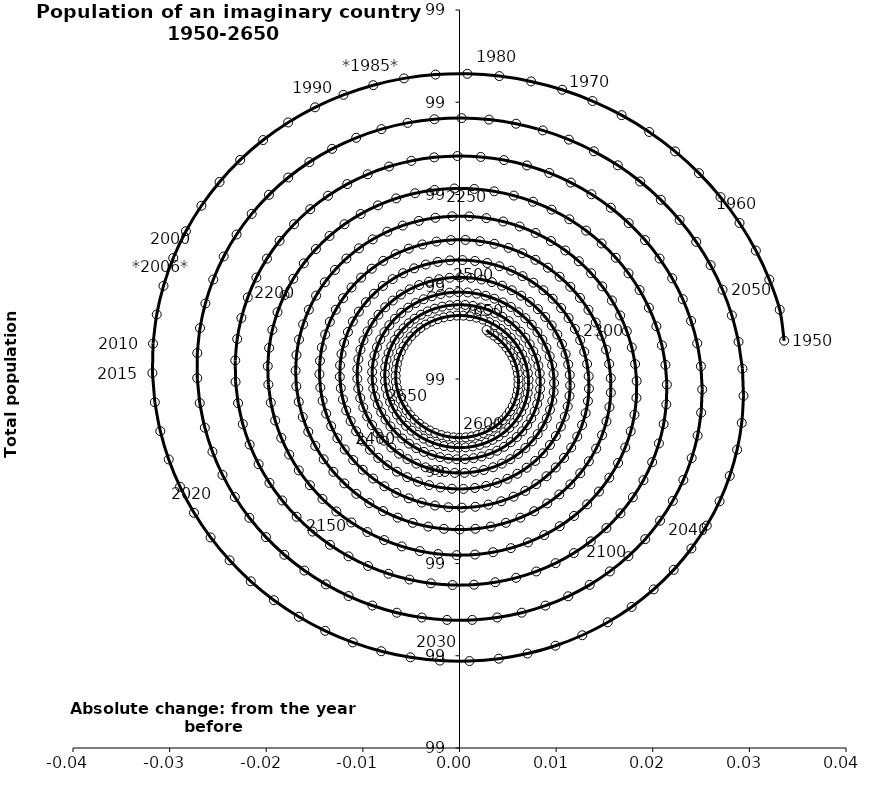
| Category | Series 0 |
|---|---|
| 0.033599910458875115 | 99.041 |
| 0.03314166945899899 | 99.075 |
| 0.032064497750972976 | 99.108 |
| 0.030672920638316725 | 99.139 |
| 0.028982384361654567 | 99.169 |
| 0.027011239629715078 | 99.197 |
| 0.024780544122428694 | 99.223 |
| 0.02231383898252659 | 99.247 |
| 0.019636901654472183 | 99.268 |
| 0.01677747765348414 | 99.286 |
| 0.013764994045004642 | 99.301 |
| 0.010630257583116531 | 99.314 |
| 0.007405140594826776 | 99.323 |
| 0.004122257804290541 | 99.328 |
| 0.0008146373648330041 | 99.331 |
| -0.002484610591359626 | 99.33 |
| -0.0057426245679437216 | 99.326 |
| -0.008927118190648287 | 99.319 |
| -0.01200669932943299 | 99.308 |
| -0.014951178710695956 | 99.294 |
| -0.01773186499434587 | 99.278 |
| -0.020321843440299858 | 99.259 |
| -0.02269623546710875 | 99.237 |
| -0.024832436609635522 | 99.214 |
| -0.026710330610171695 | 99.188 |
| -0.028312477626954546 | 99.16 |
| -0.02962427481232055 | 99.131 |
| -0.030634087796677534 | 99.101 |
| -0.0313333519121457 | 99.07 |
| -0.031716642297546116 | 99.038 |
| -0.031781712340333 | 99.006 |
| -0.031529500230384144 | 98.975 |
| -0.030964103719320235 | 98.943 |
| -0.03009272349530079 | 98.913 |
| -0.02892557589495226 | 98.883 |
| -0.027475775975752015 | 98.855 |
| -0.025759192262633235 | 98.828 |
| -0.023794274758913048 | 98.803 |
| -0.02160185807009185 | 98.781 |
| -0.019204941727963387 | 98.76 |
| -0.016628450019702257 | 98.742 |
| -0.013898973819287619 | 98.727 |
| -0.0110444970857273 | 98.714 |
| -0.008094110832267631 | 98.705 |
| -0.0050777174815266335 | 98.698 |
| -0.002025728603051391 | 98.695 |
| 0.0010312409193460326 | 98.694 |
| 0.004062679222471388 | 98.697 |
| 0.007038481243391459 | 98.702 |
| 0.009929246927015356 | 98.711 |
| 0.012706570915256066 | 98.722 |
| 0.015343320871373578 | 98.736 |
| 0.017813901720330705 | 98.753 |
| 0.02009450324023021 | 98.772 |
| 0.0221633286186389 | 98.793 |
| 0.02400080178926345 | 98.816 |
| 0.02558975158721921 | 98.841 |
| 0.026915571001808303 | 98.867 |
| 0.02796635006275494 | 98.895 |
| 0.028732981166356808 | 98.923 |
| 0.029209235928320254 | 98.952 |
| 0.02939181293894677 | 98.982 |
| 0.029280356089664394 | 99.011 |
| 0.028877443434723205 | 99.04 |
| 0.02818854684612404 | 99.069 |
| 0.02722196300997126 | 99.097 |
| 0.025988716595136907 | 99.123 |
| 0.02450243669882468 | 99.149 |
| 0.02277920793461874 | 99.172 |
| 0.020837397774329247 | 99.194 |
| 0.01869746198425304 | 99.214 |
| 0.016381730205289102 | 99.232 |
| 0.013914173914400862 | 99.247 |
| 0.011320159169500243 | 99.259 |
| 0.00862618667931514 | 99.269 |
| 0.005859621853936403 | 99.277 |
| 0.0030484175780500777 | 99.281 |
| 0.0002208325080061968 | 99.283 |
| -0.00259485227551437 | 99.282 |
| -0.005370615425363212 | 99.278 |
| -0.00807897348813924 | 99.271 |
| -0.010693252312684365 | 99.261 |
| -0.013187849033819532 | 99.249 |
| -0.01553848206551578 | 99.235 |
| -0.017722426670196967 | 99.218 |
| -0.01971873382669287 | 99.2 |
| -0.0215084302975157 | 99.179 |
| -0.023074697993855864 | 99.157 |
| -0.024403030952754534 | 99.133 |
| -0.025481368472682675 | 99.108 |
| -0.02630020319860904 | 99.082 |
| -0.026852663203548843 | 99.055 |
| -0.02713456737768638 | 99.028 |
| -0.027144453705986393 | 99.001 |
| -0.026883580287211828 | 98.974 |
| -0.026355899220313006 | 98.947 |
| -0.025568003753974722 | 98.921 |
| -0.024529049359649946 | 98.896 |
| -0.023250649645291332 | 98.872 |
| -0.021746748273329786 | 98.85 |
| -0.02003346827999053 | 98.829 |
| -0.01812894041127322 | 98.809 |
| -0.01605311229230466 | 98.792 |
| -0.013827540428863472 | 98.777 |
| -0.01147516720097741 | 98.765 |
| -0.009020085147461998 | 98.754 |
| -0.0064872909556825675 | 98.747 |
| -0.0039024316612383814 | 98.741 |
| -0.0012915456275806037 | 98.739 |
| 0.0013191990851950663 | 98.739 |
| 0.0039037663401302325 | 98.741 |
| 0.00643651092268982 | 98.747 |
| 0.008892432349590251 | 98.754 |
| 0.011247420981895573 | 98.764 |
| 0.013478494026337273 | 98.777 |
| 0.015564019121491413 | 98.791 |
| 0.017483923341032437 | 98.808 |
| 0.019219885602488773 | 98.826 |
| 0.020755510645180664 | 98.846 |
| 0.022076482934373587 | 98.868 |
| 0.023170699056812794 | 98.891 |
| 0.024028377394493816 | 98.914 |
| 0.024642144096326035 | 98.939 |
| 0.025007094608447744 | 98.964 |
| 0.025120830271433192 | 98.989 |
| 0.024983469743801834 | 99.014 |
| 0.024597635263532425 | 99.039 |
| 0.023968414009871708 | 99.063 |
| 0.023103295075202368 | 99.087 |
| 0.02201208279708311 | 99.109 |
| 0.020706787432636986 | 99.131 |
| 0.01920149437879104 | 99.151 |
| 0.017512213349384353 | 99.169 |
| 0.015656709113393674 | 99.186 |
| 0.013654315574399334 | 99.2 |
| 0.011525735128238068 | 99.213 |
| 0.009292825373577784 | 99.223 |
| 0.006978375365477518 | 99.232 |
| 0.004605873695403773 | 99.237 |
| 0.002199270751674476 | 99.241 |
| -0.00021726243993214212 | 99.242 |
| -0.0026195763732346222 | 99.24 |
| -0.004983783796262742 | 99.236 |
| -0.0072864966297245815 | 99.23 |
| -0.009505056725700456 | 99.222 |
| -0.01161775819581834 | 99.211 |
| -0.013604059133641044 | 99.199 |
| -0.015444780672858371 | 99.184 |
| -0.017122291459102712 | 99.168 |
| -0.018620675768339368 | 99.15 |
| -0.01992588367701842 | 99.131 |
| -0.02102586187560007 | 99.11 |
| -0.0219106639174953 | 99.088 |
| -0.022572538906558748 | 99.066 |
| -0.023005997846027526 | 99.043 |
| -0.02320785709884632 | 99.02 |
| -0.02317725863985487 | 98.997 |
| -0.022915667013798213 | 98.974 |
| -0.022426843145652242 | 98.951 |
| -0.02171679537980964 | 98.929 |
| -0.020793708350105078 | 98.908 |
| -0.019667850500496797 | 98.887 |
| -0.01835146128532017 | 98.868 |
| -0.016858619275261333 | 98.851 |
| -0.015205092579790858 | 98.835 |
| -0.013408173165899484 | 98.82 |
| -0.011486496805737545 | 98.808 |
| -0.009459850520698865 | 98.797 |
| -0.007348969504441527 | 98.789 |
| -0.005175325602650105 | 98.783 |
| -0.0029609095012119724 | 98.779 |
| -0.0007280088263783568 | 98.777 |
| 0.0015010156097687855 | 98.777 |
| 0.0037039531777409707 | 98.78 |
| 0.0058589641871833464 | 98.784 |
| 0.00794479584310892 | 98.791 |
| 0.009940991271939481 | 98.8 |
| 0.011828089567316624 | 98.811 |
| 0.013587814905456241 | 98.824 |
| 0.015203252898480457 | 98.838 |
| 0.01665901249071311 | 98.854 |
| 0.017941371855357602 | 98.872 |
| 0.019038406916301653 | 98.89 |
| 0.019940101300115032 | 98.91 |
| 0.020638436714200736 | 98.93 |
| 0.021127462947369224 | 98.951 |
| 0.02140334689649137 | 98.972 |
| 0.02146440023470575 | 98.994 |
| 0.021311085551879216 | 99.015 |
| 0.020946001013555815 | 99.037 |
| 0.020373843798289215 | 99.057 |
| 0.019601352784022197 | 99.077 |
| 0.018637231158528778 | 99.096 |
| 0.01749204982588992 | 99.115 |
| 0.016178132668059675 | 99.131 |
| 0.014709424896295786 | 99.147 |
| 0.013101345889793947 | 99.161 |
| 0.011370628066458721 | 99.173 |
| 0.009535143462407802 | 99.184 |
| 0.00761371981106862 | 99.192 |
| 0.0056259480085287805 | 99.199 |
| 0.003591982928021764 | 99.203 |
| 0.001532339603450339 | 99.206 |
| -0.0005323131624095367 | 99.207 |
| -0.0025813596939627814 | 99.205 |
| -0.004594442777012375 | 99.201 |
| -0.006551665391249628 | 99.196 |
| -0.008433786847177771 | 99.188 |
| -0.010222411399169573 | 99.179 |
| -0.011900167491262437 | 99.168 |
| -0.013450875894754688 | 99.155 |
| -0.014859705116151645 | 99.141 |
| -0.016113312589190798 | 99.125 |
| -0.01719997031356968 | 99.109 |
| -0.01810967376509609 | 99.091 |
| -0.018834233074521478 | 99.072 |
| -0.01936734565409637 | 99.053 |
| -0.01970464964013985 | 99.034 |
| -0.019843757714305355 | 99.014 |
| -0.01978427106416092 | 98.994 |
| -0.019527773442760576 | 98.974 |
| -0.019077805485871124 | 98.955 |
| -0.018439819641400845 | 98.936 |
| -0.01762111625714624 | 98.918 |
| -0.01663076155831078 | 98.901 |
| -0.015479488423089549 | 98.885 |
| -0.01417958103172623 | 98.87 |
| -0.01274474461968822 | 98.856 |
| -0.011189961708495844 | 98.844 |
| -0.009531336315170336 | 98.834 |
| -0.0077859277540852645 | 98.825 |
| -0.0059715757406451075 | 98.819 |
| -0.0041067185843104426 | 98.813 |
| -0.0022102063186579812 | 98.81 |
| -0.0003011106573111988 | 98.809 |
| 0.0016014663129979567 | 98.81 |
| 0.0034785827882117815 | 98.812 |
| 0.005311645353323513 | 98.817 |
| 0.007082592676070476 | 98.823 |
| 0.008774072978027903 | 98.831 |
| 0.010369613544199296 | 98.84 |
| 0.011853780620370458 | 98.852 |
| 0.013212328151404051 | 98.864 |
| 0.014432333932809627 | 98.878 |
| 0.015502321880639158 | 98.893 |
| 0.01641236926938916 | 98.909 |
| 0.01715419794346218 | 98.926 |
| 0.017721248672579293 | 98.943 |
| 0.018108737993486557 | 98.961 |
| 0.01831369705853092 | 98.98 |
| 0.01833499219348056 | 98.998 |
| 0.018173327050547528 | 99.016 |
| 0.01783122642726198 | 99.034 |
| 0.017313002003767508 | 99.052 |
| 0.016624700430455164 | 99.069 |
| 0.01577403437188707 | 99.085 |
| 0.014770297279383726 | 99.1 |
| 0.013624262823597633 | 99.115 |
| 0.012348070066664718 | 99.128 |
| 0.010955095589856967 | 99.139 |
| 0.009459813917409576 | 99.15 |
| 0.007877647686719058 | 99.158 |
| 0.006224809110307206 | 99.165 |
| 0.004518134354171366 | 99.171 |
| 0.002774912519370787 | 99.174 |
| 0.0010127109596496098 | 99.176 |
| -0.0007508013048180828 | 99.176 |
| -0.0024980303069028764 | 99.175 |
| -0.004211632221981176 | 99.171 |
| -0.005874685089580112 | 99.166 |
| -0.007470855471275684 | 99.16 |
| -0.00898455840807344 | 99.151 |
| -0.010401109115498741 | 99.142 |
| -0.011706864944635242 | 99.131 |
| -0.012889356241984729 | 99.118 |
| -0.01393740485843864 | 99.105 |
| -0.014841229187069871 | 99.09 |
| -0.015592534749366393 | 99.075 |
| -0.01618458949864987 | 99.059 |
| -0.016612283165777342 | 99.043 |
| -0.016872170134988096 | 99.026 |
| -0.016962495504415642 | 99.009 |
| -0.01688320415512834 | 98.992 |
| -0.016635932823184874 | 98.975 |
| -0.01622398533832836 | 98.959 |
| -0.015652291360360948 | 98.943 |
| -0.014927349107068721 | 98.927 |
| -0.014057152724504363 | 98.913 |
| -0.013051105100785776 | 98.899 |
| -0.011919917065348784 | 98.887 |
| -0.010675494046950007 | 98.876 |
| -0.009330811383271964 | 98.865 |
| -0.007899779582238864 | 98.857 |
| -0.006397100928964505 | 98.85 |
| -0.0048381189115076495 | 98.844 |
| -0.003238662002921444 | 98.84 |
| -0.001614883385720134 | 98.838 |
| 1.690176256374798e-05 | 98.837 |
| 0.0016403797879434023 | 98.838 |
| 0.0032394012476686385 | 98.84 |
| 0.0047981411489104175 | 98.844 |
| 0.006301255152543206 | 98.85 |
| 0.007734030204268549 | 98.857 |
| 0.009082528118717903 | 98.865 |
| 0.010333720719678752 | 98.875 |
| 0.011475615230843061 | 98.886 |
| 0.01249736871513818 | 98.898 |
| 0.0133893904760356 | 98.911 |
| 0.014143431459551437 | 98.925 |
| 0.01475265983021501 | 98.939 |
| 0.015211722036319486 | 98.954 |
| 0.0155167888276182 | 98.97 |
| 0.01566558584176647 | 98.985 |
| 0.01565740853150288 | 99.001 |
| 0.015493121361487283 | 99.016 |
| 0.015175141361574163 | 99.032 |
| 0.014707406278475332 | 99.047 |
| 0.01409532772011346 | 99.061 |
| 0.01334572983502369 | 99.075 |
| 0.012466774210338372 | 99.088 |
| 0.011467871806132734 | 99.1 |
| 0.010359582869050143 | 99.111 |
| 0.00915350588336139 | 99.121 |
| 0.007862156721529345 | 99.129 |
| 0.006498839248521904 | 99.136 |
| 0.005077508712780343 | 99.142 |
| 0.0036126293223404105 | 99.147 |
| 0.002119027455556477 | 99.149 |
| 0.0006117419918751921 | 99.151 |
| -0.0008941267300883737 | 99.151 |
| -0.002383567814050025 | 99.149 |
| -0.00384180906299747 | 99.146 |
| -0.005254463111143082 | 99.141 |
| -0.006607668989126125 | 99.135 |
| -0.007888227733431563 | 99.128 |
| -0.009083730717300398 | 99.12 |
| -0.010182679459624921 | 99.11 |
| -0.011174595759378292 | 99.099 |
| -0.01205012110561654 | 99.088 |
| -0.012801104425008702 | 99.075 |
| -0.013420677350005406 | 99.062 |
| -0.013903316319243686 | 99.048 |
| -0.014244890956526035 | 99.034 |
| -0.014442698314383051 | 99.02 |
| -0.014495482711048169 | 99.005 |
| -0.014403441035092612 | 98.991 |
| -0.014168213537153918 | 98.976 |
| -0.013792860272957341 | 98.962 |
| -0.01328182350420093 | 98.949 |
| -0.01264087650232426 | 98.936 |
| -0.011877059333500029 | 98.924 |
| -0.010998602330147378 | 98.912 |
| -0.01001483807375081 | 98.902 |
| -0.00893610282393098 | 98.892 |
| -0.0077736284295397695 | 98.884 |
| -0.006539425847137181 | 98.877 |
| -0.0052461614704242265 | 98.871 |
| -0.003907027539888475 | 98.866 |
| -0.0025356079544778254 | 98.863 |
| -0.001145740846567378 | 98.861 |
| 0.00024862069312803214 | 98.861 |
| 0.0016335483424398944 | 98.861 |
| 0.00299527733075422 | 98.864 |
| 0.004320342898772367 | 98.867 |
| 0.005595713085639886 | 98.872 |
| 0.006808916537529797 | 98.879 |
| 0.007948164087842713 | 98.886 |
| 0.009002462927618637 | 98.895 |
| 0.00996172226452785 | 98.904 |
| 0.010816849459047262 | 98.914 |
| 0.01155983572662933 | 98.926 |
| 0.012183830603213153 | 98.938 |
| 0.012683204487480282 | 98.95 |
| 0.013053598695528024 | 98.963 |
| 0.01329196259106169 | 98.976 |
| 0.013396577485409011 | 98.99 |
| 0.013367067134787192 | 99.003 |
| 0.013204394797057262 | 99.016 |
| 0.012910846944436116 | 99.029 |
| 0.012490003861074683 | 99.042 |
| 0.011946697484077617 | 99.054 |
| 0.01128695697218518 | 99.066 |
| 0.010517942606078634 | 99.077 |
| 0.00964786873770862 | 99.087 |
| 0.00868591661173923 | 99.096 |
| 0.007642137978983499 | 99.104 |
| 0.006527350509095697 | 99.112 |
| 0.005353026086361012 | 99.117 |
| 0.0041311731382123185 | 99.122 |
| 0.002874214199678704 | 99.126 |
| 0.001594859958643724 | 99.128 |
| 0.00030598105552570587 | 99.129 |
| -0.000979521072807188 | 99.129 |
| -0.002248843012097268 | 99.127 |
| -0.003489406569698872 | 99.124 |
| -0.004688983093025456 | 99.12 |
| -0.005835813682040225 | 99.115 |
| -0.006918724117326747 | 99.108 |
| -0.007927233384016574 | 99.101 |
| -0.008851654741079074 | 99.092 |
| -0.009683188365315232 | 99.083 |
| -0.010414004688087175 | 99.073 |
| -0.011037317640095523 | 99.062 |
| -0.011547447124080179 | 99.051 |
| -0.011939870146122189 | 99.039 |
| -0.012211260152163561 | 99.027 |
| -0.012359514236329971 | 99.015 |
| -0.012383768010167273 | 99.002 |
| -0.012284398045977696 | 98.99 |
| -0.012063011931999768 | 98.978 |
| -0.011722426100263306 | 98.966 |
| -0.011266631709311525 | 98.954 |
| -0.01070074898157003 | 98.943 |
| -0.010030970508374537 | 98.933 |
| -0.009264494143074842 | 98.923 |
| -0.008409446203394566 | 98.914 |
| -0.007474795797257627 | 98.907 |
| -0.006470261170868241 | 98.9 |
| -0.0054062090527438045 | 98.894 |
| -0.004293548032407557 | 98.889 |
| -0.0031436170670247066 | 98.885 |
| -0.0019680702519835336 | 98.882 |
| -0.000778759023383202 | 98.881 |
| 0.00041238702008428163 | 98.881 |
| 0.001593479480334281 | 98.882 |
| 0.002752789516826226 | 98.884 |
| 0.0038788640220346338 | 98.887 |
| 0.004960638467508716 | 98.892 |
| 0.005987545311917586 | 98.897 |
| 0.006949616911946066 | 98.904 |
| 0.00783758193709616 | 98.911 |
| 0.008642954359444843 | 98.919 |
| 0.009358114167710596 | 98.928 |
| 0.0099763790419658 | 98.938 |
| 0.010492066319400806 | 98.948 |
| 0.010900544681469171 | 98.959 |
| 0.011198275098180943 | 98.97 |
| 0.011382840674912131 | 98.982 |
| 0.011452965159314488 | 98.993 |
| 0.011408519980314225 | 99.004 |
| 0.011250519806310422 | 99.016 |
| 0.01098110672396757 | 99.027 |
| 0.010603523252257219 | 99.038 |
| 0.010122074516544899 | 99.048 |
| 0.00954208001399337 | 99.058 |
| 0.008869815503253164 | 99.067 |
| 0.008112445647185496 | 99.076 |
| 0.0072779481266280754 | 99.083 |
| 0.006375030024358352 | 99.09 |
| 0.005413037351829075 | 99.096 |
| 0.004401858655157298 | 99.101 |
| 0.0033518236911831423 | 99.105 |
| 0.002273598208702765 | 99.108 |
| 0.0011780759036525978 | 99.11 |
| 7.626863990140009e-05 | 99.11 |
| -0.0010208039609764796 | 99.11 |
| -0.002102224456578483 | 99.108 |
| -0.0031572859532360553 | 99.106 |
| -0.0041755978352568945 | 99.102 |
| -0.005147187812646337 | 99.097 |
| -0.00606259928792241 | 99.092 |
| -0.006912983094281344 | 99.085 |
| -0.0076901827184201466 | 99.078 |
| -0.008386812190401827 | 99.07 |
| -0.00899632590056143 | 99.061 |
| -0.009513079687252457 | 99.052 |
| -0.009932382629806114 | 99.042 |
| -0.010250539076601228 | 99.032 |
| -0.010464880537682575 | 99.021 |
| -0.010573787174514848 | 99.011 |
| -0.010576698724399591 | 99 |
| -0.010474114803294299 | 98.99 |
| -0.010267584636956428 | 98.979 |
| -0.009959686375680121 | 98.969 |
| -0.009553996250723173 | 98.959 |
| -0.009055047930758064 | 98.95 |
| -0.008468282532547278 | 98.941 |
| -0.007799989830999721 | 98.933 |
| -0.0070572412988667566 | 98.926 |
| -0.00624781568448185 | 98.919 |
| -0.005380117907115789 | 98.913 |
| -0.00446309211202589 | 98.908 |
| -0.003506129781513323 | 98.904 |
| -0.0025189738429602926 | 98.901 |
| -0.0015116197502251794 | 98.899 |
| -0.0004942145399340347 | 98.898 |
| 0.0005230451204951692 | 98.898 |
| 0.0015300148712995565 | 98.899 |
| 0.002516703568737455 | 98.901 |
| 0.0034733721621336144 | 98.904 |
| 0.004390629563751247 | 98.908 |
| 0.005259524570121243 | 98.913 |
| 0.0060716329381520495 | 98.919 |
| 0.006819138771483324 | 98.925 |
| 0.0074949094338947475 | 98.932 |
| 0.008092563275056364 | 98.94 |
| 0.008606529528876194 | 98.949 |
| 0.009032099826157491 | 98.957 |
| 0.00936547084977235 | 98.967 |
| 0.009603777751031828 | 98.976 |
| 0.009745118040001444 | 98.986 |
| 0.009788565759215828 | 98.996 |
| 0.009734175847711413 | 99.005 |
| 0.009582978700905187 | 99.015 |
| 0.009336965029369537 | 99.025 |
| 0.008999061215973825 | 99.034 |
| 0.008573095464541325 | 99.043 |
| 0.008063755123451699 | 99.051 |
| 0.007476535653943017 | 99.059 |
| 0.006817681793648944 | 99.066 |
| 0.006094121541067921 | 99.072 |
| 0.005313393655121956 | 99.078 |
| 0.004483569425325129 | 99.083 |
| 0.003613169521152315 | 99.087 |
| 0.0027110767744389364 | 99.09 |
| 0.0017864457850365056 | 99.092 |
| 0.0008486102669706952 | 99.094 |
| -9.301092967461955e-05 | 99.094 |
| -0.0010290081771131554 | 99.094 |
| -0.0019500748656682276 | 99.092 |
| -0.002847099704382572 | 99.09 |
| -0.003711256613343039 | 99.086 |
| -0.004534091323328937 | 99.082 |
| -0.005307603835426278 | 99.077 |
| -0.006024325938959407 | 99.072 |
| -0.00667739303937509 | 99.065 |
| -0.007260609607968149 | 99.058 |
| -0.0077685076326048375 | 99.051 |
| -0.008196397521508914 | 99.043 |
| -0.008540410989937186 | 99.034 |
| -0.008797535542157675 | 99.026 |
| -0.008965640246643147 | 99.017 |
| -0.0090434925909193 | 99.008 |
| -0.009030766292518422 | 98.999 |
| -0.0089280400331333 | 98.99 |
| -0.0087367871738806 | 98.981 |
| -0.008459356599338719 | 98.972 |
| -0.008098944925549745 | 98.964 |
| -0.007659560392170306 | 98.956 |
| -0.00714597884055479 | 98.949 |
| -0.0065636922560159405 | 98.942 |
| -0.005918850424741606 | 98.935 |
| -0.0052181963214650295 | 98.93 |
| -0.0044689959034869275 | 98.925 |
| -0.0036789630392704 | 98.921 |
| -0.0028561803443736267 | 98.918 |
| -0.0020090167347746046 | 98.915 |
| -0.0011460425360709792 | 98.914 |
| -0.0002759430075087721 | 98.913 |
| 0.0005925688489796244 | 98.913 |
| 0.0014508393215351134 | 98.914 |
| 0.0022903599957331267 | 98.916 |
| 0.0031028518839519847 | 98.919 |
| 0.003880346847061844 | 98.922 |
| 0.0046152655100186735 | 98.926 |
| 0.005300490911615441 | 98.931 |
| 0.005929437175332453 | 98.937 |
| 0.0064961125412068554 | 98.943 |
| 0.006995176158234528 | 98.95 |
| 0.007421988101988575 | 98.957 |
| 0.007772652152503667 | 98.965 |
| 0.008044050941897751 | 98.973 |
| 0.008233873159149141 | 98.981 |
| 0.008340632580527085 | 98.989 |
| 0.008363678776447614 | 98.998 |
| 0.00830319942966895 | 99.006 |
| 0.008160214283428502 | 99.014 |
| 0.007936560821676153 | 99.022 |
| 0.007634871865420223 | 99.03 |
| 0.0072585453489466545 | 99.038 |
| 0.006811706616389301 | 99.045 |
| 0.006299163651853235 | 99.051 |
| 0.0057263557249243036 | 99.057 |
| 0.005099295996522812 | 99.063 |
| 0.004424508687648654 | 99.067 |
| 0.003708961464653271 | 99.072 |
| 0.0029599937393172127 | 99.075 |
| 0.002185241619173439 | 99.077 |
| 0.0013925602731248432 | 99.079 |
| 0.0005899444996373404 | 99.08 |
| -0.0002145517014398024 | 99.08 |
| -0.001012895746328013 | 99.08 |
| -0.0017971564690952846 | 99.078 |
| -0.002559582713047348 | 99.076 |
| -0.003292679734812509 | 99.073 |
| -0.0039892826702470074 | 99.07 |
| -0.004642626344036671 | 99.065 |
| -0.005246410745023411 | 99.06 |
| -0.005794861535946438 | 99.055 |
| -0.006282785018782988 | 99.049 |
| -0.006705617035379419 | 99.042 |
| -0.007059465345761851 | 99.035 |
| -0.007341145093995749 | 99.028 |
| -0.007548207042589183 | 99.021 |
| -0.007678958329712771 | 99.013 |
| -0.007732475579544484 | 99.005 |
| -0.0077086102732835116 | 98.998 |
| -0.007607986365705699 | 98.99 |
| -0.007431990209695982 | 98.982 |
| -0.007182752927811009 | 98.975 |
| -0.006863125444127149 | 98.968 |
| -0.006476646462004965 | 98.961 |
| -0.0060275037425086 | 98.955 |
| -0.005520489102877946 | 98.949 |
| -0.004960947615131772 | 98.944 |
| -0.0043547215405723705 | 98.939 |
| -0.0037080895854373352 | 98.935 |
| -0.0030277021068556564 | 98.932 |
| -0.0023205129354977316 | 98.929 |
| -0.0015937085117485594 | 98.927 |
| -0.0008546350555320714 | 98.926 |
| -0.00011072450586624427 | 98.926 |
| 0.0006305800250530069 | 98.926 |
| 0.0013618985374463932 | 98.927 |
| 0.002075987429542181 | 98.929 |
| 0.002765811057415135 | 98.931 |
| 0.0034246108639734985 | 98.934 |
| 0.004045971399783355 | 98.938 |
| 0.0046238825927957805 | 98.942 |
| 0.005152797664678133 | 98.947 |
| 0.005627686137934518 | 98.953 |
| 0.006044081429564585 | 98.958 |
| 0.006398122583668453 | 98.965 |
| 0.0066865897560006715 | 98.971 |
| 0.006906933127773129 | 98.978 |
| 0.007057294993146002 | 98.985 |
| 0.007136524834081115 | 98.992 |
| 0.007144187267329016 | 98.999 |
| 0.007080562819723468 | 99.006 |
| 0.006946641559856914 | 99.013 |
| 0.006744109685364208 | 99.02 |
| 0.006475329234568505 | 99.027 |
| 0.006143311159192422 | 99.033 |
| 0.0057516820598024765 | 99.039 |
| 0.005304644947365489 | 99.045 |
| 0.00480693445188507 | 99.05 |
| 0.004263766952703918 | 99.054 |
| 0.003680786153097415 | 99.058 |
| 0.0030640046645018515 | 99.062 |
| 0.0024197422031164706 | 99.064 |
| 0.0017545610319587013 | 99.067 |
| 0.0010751993060011955 | 99.068 |
| 0.00038850299556969503 | 99.069 |
| -0.0002986429259621559 | 99.069 |
| -0.000979383340187212 | 99.068 |
| -0.0016469612006062562 | 99.067 |
| -0.0022947844312000143 | 99.065 |
| -0.002916490846089914 | 99.062 |
| -0.003506010452795749 | 99.059 |
| -0.004057624530695136 | 99.055 |
| -0.0045660209115467865 | 99.051 |
| -0.0050263449298242335 | 99.046 |
| -0.005434245556330097 | 99.041 |
| -0.005785916278874481 | 99.035 |
| -0.00607813034868343 | 99.029 |
| -0.006308270069027344 | 99.023 |
| -0.006474349863729856 | 99.017 |
| -0.006575032926548374 | 99.01 |
| -0.006609641317304238 | 99.003 |
| -0.006578159436841702 | 98.997 |
| -0.0064812308791744044 | 98.99 |
| -0.00632014872518738 | 98.984 |
| -0.006096839407490506 | 98.978 |
| -0.005813840339328635 | 98.972 |
| -0.0054742715617877025 | 98.966 |
| -0.005081801721914303 | 98.961 |
| -0.004640608749234332 | 98.956 |
| -0.004155335649436154 | 98.951 |
| -0.003631041880282737 | 98.948 |
| -0.003073150816796044 | 98.944 |
| -0.00248739384912966 | 98.941 |
| -0.0018797516874400344 | 98.939 |
| -0.0012563934730636106 | 98.938 |
| -0.000623614314100962 | 98.937 |
| 1.2228123679847158e-05 | 98.936 |
| 0.0006447773335409579 | 98.937 |
| 0.001267741355150065 | 98.938 |
| 0.0018749552021617433 | 98.939 |
| 0.0024604417119959976 | 98.941 |
| 0.0030184702190680923 | 98.944 |
| 0.003543612477081126 | 98.947 |
| 0.004030795286318778 | 98.951 |
| 0.0044753493176585835 | 98.956 |
| 0.0048730536652783485 | 98.96 |
| 0.0052201757050553965 | 98.965 |
| 0.005513505884522374 | 98.971 |
| 0.005750387122759548 | 98.976 |
| 0.005928738553905077 | 98.982 |
| 0.00604707340563948 | 98.988 |
| 0.0061045108636434975 | 98.994 |
| 0.006100781833701774 | 99 |
| 0.006036228574394897 | 99.006 |
| 0.005911798234649268 | 99.012 |
| 0.0057290303909312 | 99.018 |
| 0.00549003873837961 | 99.024 |
| 0.00519748714763324 | 99.029 |
| 0.004854560354104365 | 99.034 |
| 0.0044649295989245275 | 99.039 |
| 0.004032713589410264 | 99.043 |
| 0.0035624351915828356 | 99.047 |
| 0.0030589743081108622 | 99.05 |
| 0.00279957901911132 | 99.053 |